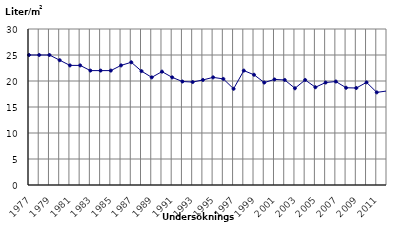
| Category | Oljeförbrukning, liter/m2 |
|---|---|
| 1977 | 25 |
| 1978 | 25 |
| 1979 | 25 |
| 1980 | 24 |
| 1981 | 23 |
| 1982 | 23 |
| 1983 | 22 |
| 1984 | 22 |
| 1985 | 22 |
| 1986 | 23 |
| 1987 | 23.6 |
| 1988 | 21.9 |
| 1989 | 20.7 |
| 1990 | 21.8 |
| 1991 | 20.7 |
| 1992 | 19.9 |
| 1993 | 19.8 |
| 1994 | 20.2 |
| 1995 | 20.7 |
| 1996 | 20.4 |
| 1997 | 18.5 |
| 1998 | 22 |
| 1999 | 21.2 |
| 2000 | 19.7 |
| 2001 | 20.3 |
| 2002 | 20.2 |
| 2003 | 18.6 |
| 2004 | 20.2 |
| 2005 | 18.8 |
| 2006 | 19.7 |
| 2007 | 19.9 |
| 2008 | 18.7 |
| 2009 | 18.653 |
| 2010 | 19.736 |
| 2011 | 17.812 |
| 2012 | 18.085 |